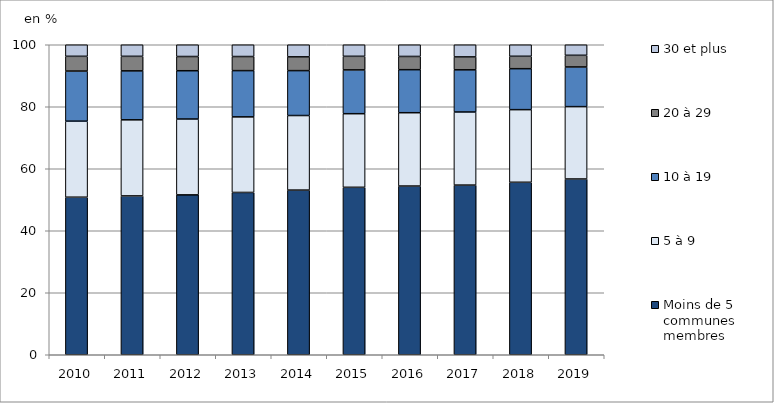
| Category | Moins de 5 communes membres | 5 à 9 | 10 à 19 | 20 à 29 | 30 et plus |
|---|---|---|---|---|---|
| 2010.0 | 50.823 | 24.527 | 16.162 | 4.762 | 3.726 |
| 2011.0 | 51.238 | 24.546 | 15.793 | 4.69 | 3.732 |
| 2012.0 | 51.575 | 24.469 | 15.575 | 4.59 | 3.792 |
| 2013.0 | 52.358 | 24.379 | 14.919 | 4.544 | 3.8 |
| 2014.0 | 53.118 | 24.054 | 14.483 | 4.442 | 3.903 |
| 2015.0 | 54.015 | 23.744 | 14.128 | 4.386 | 3.728 |
| 2016.0 | 54.425 | 23.652 | 13.883 | 4.266 | 3.774 |
| 2017.0 | 54.729 | 23.58 | 13.603 | 4.168 | 3.92 |
| 2018.0 | 55.639 | 23.424 | 13.22 | 4.001 | 3.716 |
| 2019.0 | 56.696 | 23.344 | 12.797 | 3.766 | 3.398 |